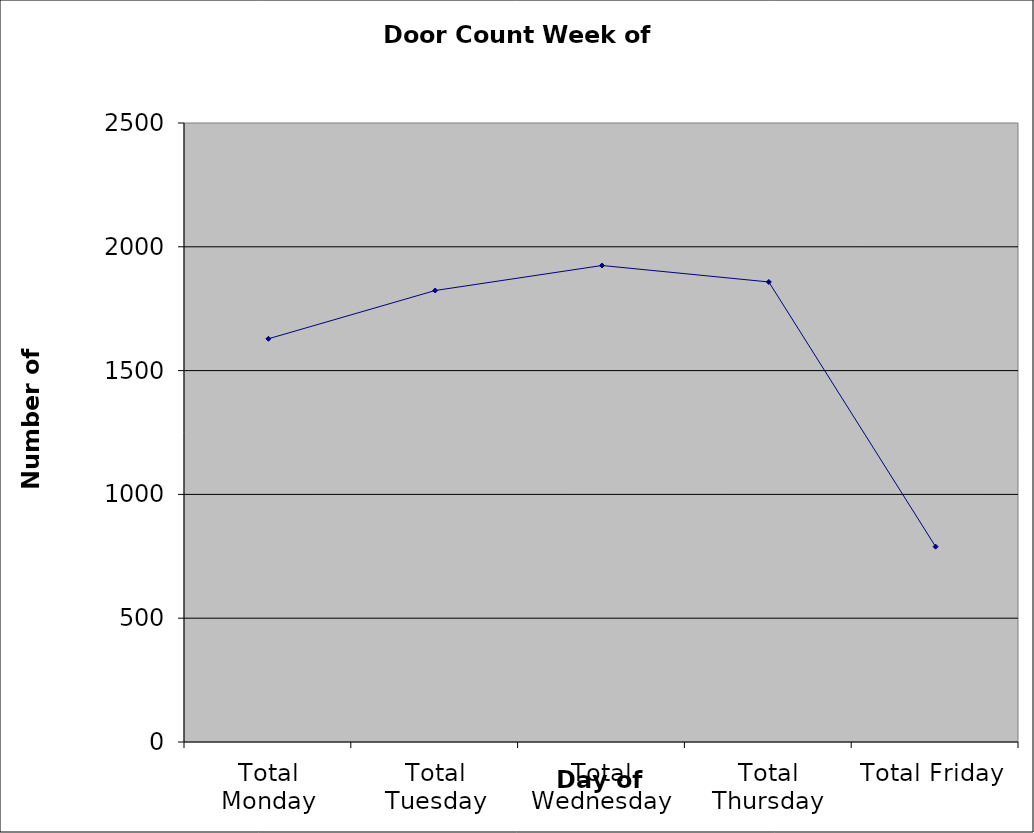
| Category | Series 0 |
|---|---|
| Total Monday | 1628.5 |
| Total Tuesday | 1823.5 |
| Total Wednesday | 1924.5 |
| Total Thursday | 1858 |
| Total Friday | 789 |